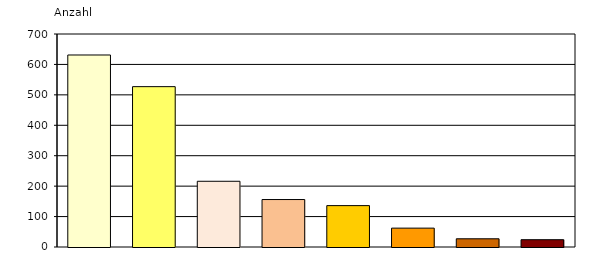
| Category | Series 0 |
|---|---|
| Überforderung der Eltern/eines Elternteil | 631 |
| unbegleitete Einreise aus dem Ausland | 527 |
| Vernachlässigung | 216 |
| Anzeichen für Misshandlung | 156 |
| Beziehungsprobleme | 136 |
| Schul- und Ausbildungsprobleme | 62 |
| Delinquenz des Kindes/Straftat des Jugendlichen | 27 |
| Anzeichen für sexuellen Missbrauch | 24 |